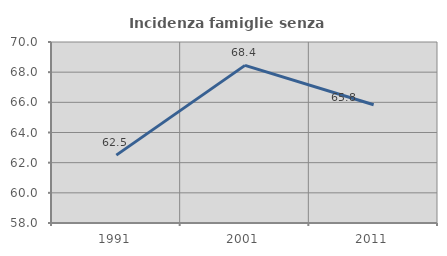
| Category | Incidenza famiglie senza nuclei |
|---|---|
| 1991.0 | 62.5 |
| 2001.0 | 68.449 |
| 2011.0 | 65.842 |